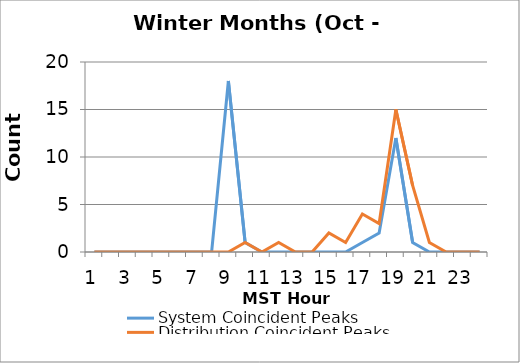
| Category | System Coincident Peaks | Distribution Coincident Peaks |
|---|---|---|
| 0 | 0 | 0 |
| 1 | 0 | 0 |
| 2 | 0 | 0 |
| 3 | 0 | 0 |
| 4 | 0 | 0 |
| 5 | 0 | 0 |
| 6 | 0 | 0 |
| 7 | 0 | 0 |
| 8 | 18 | 0 |
| 9 | 1 | 1 |
| 10 | 0 | 0 |
| 11 | 0 | 1 |
| 12 | 0 | 0 |
| 13 | 0 | 0 |
| 14 | 0 | 2 |
| 15 | 0 | 1 |
| 16 | 1 | 4 |
| 17 | 2 | 3 |
| 18 | 12 | 15 |
| 19 | 1 | 7 |
| 20 | 0 | 1 |
| 21 | 0 | 0 |
| 22 | 0 | 0 |
| 23 | 0 | 0 |